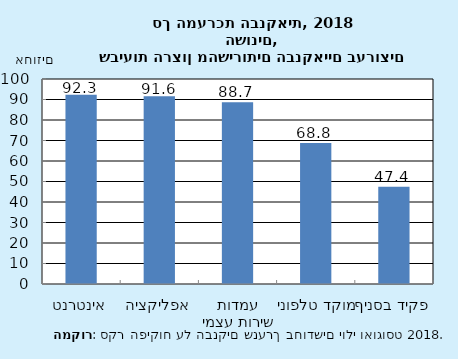
| Category | Series 0 |
|---|---|
| אינטרנט | 92.3 |
| אפליקציה | 91.6 |
| עמדות שירות עצמי | 88.7 |
| מוקד טלפוני | 68.8 |
| פקיד בסניף | 47.4 |